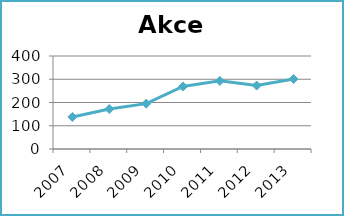
| Category | Akce |
|---|---|
| 2007.0 | 138 |
| 2008.0 | 172 |
| 2009.0 | 195 |
| 2010.0 | 269 |
| 2011.0 | 293 |
| 2012.0 | 273 |
| 2013.0 | 301 |